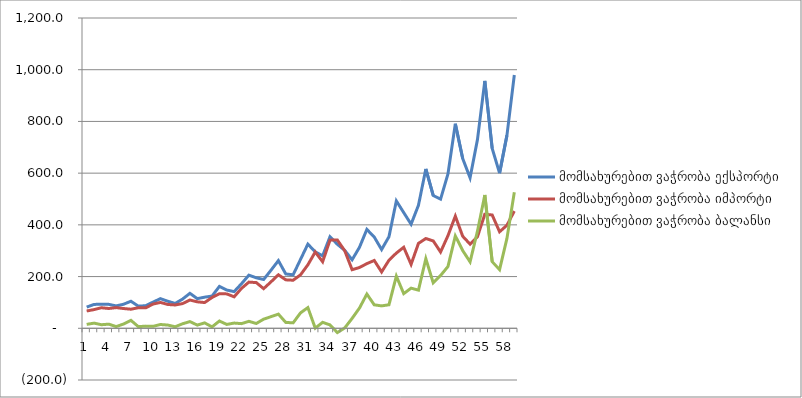
| Category | მომსახურებით ვაჭრობა ექსპორტი  | მომსახურებით ვაჭრობა იმპორტი | მომსახურებით ვაჭრობა ბალანსი |
|---|---|---|---|
| 0 | 81.988 | 66.947 | 15.04 |
| 1 | 92.25 | 72.29 | 19.96 |
| 2 | 93.214 | 79.405 | 13.809 |
| 3 | 92.523 | 76.534 | 15.989 |
| 4 | 86.562 | 80.06 | 6.502 |
| 5 | 92.95 | 76.382 | 16.568 |
| 6 | 104.612 | 73.803 | 30.809 |
| 7 | 85.676 | 79.382 | 6.294 |
| 8 | 87.345 | 78.991 | 8.354 |
| 9 | 101.22 | 93.696 | 7.525 |
| 10 | 114.616 | 99.961 | 14.656 |
| 11 | 104.598 | 92.133 | 12.465 |
| 12 | 96.102 | 90.163 | 5.939 |
| 13 | 112.856 | 95.466 | 17.39 |
| 14 | 135.186 | 109.319 | 25.867 |
| 15 | 114.699 | 102.348 | 12.351 |
| 16 | 120.398 | 99.522 | 20.876 |
| 17 | 124.571 | 119.128 | 5.443 |
| 18 | 161.882 | 133.812 | 28.07 |
| 19 | 147.911 | 132.982 | 14.929 |
| 20 | 141.812 | 121.639 | 20.172 |
| 21 | 172.457 | 154.479 | 17.977 |
| 22 | 205.507 | 178.573 | 26.934 |
| 23 | 195.268 | 176.761 | 18.507 |
| 24 | 188.633 | 153.281 | 35.352 |
| 25 | 224.576 | 179.624 | 44.951 |
| 26 | 261.754 | 206.958 | 54.796 |
| 27 | 210.124 | 187.399 | 22.725 |
| 28 | 206.876 | 185.862 | 21.014 |
| 29 | 266.162 | 206.602 | 59.56 |
| 30 | 325.432 | 245.425 | 80.007 |
| 31 | 295.639 | 295.031 | 0.608 |
| 32 | 280.197 | 257.248 | 22.949 |
| 33 | 354.066 | 340.846 | 13.22 |
| 34 | 324.889 | 341.447 | -16.558 |
| 35 | 301.302 | 299.882 | 1.419 |
| 36 | 264.904 | 226.562 | 38.342 |
| 37 | 313.311 | 235.037 | 78.274 |
| 38 | 382.383 | 249.991 | 132.392 |
| 39 | 353.01 | 262.293 | 90.717 |
| 40 | 304.484 | 217.879 | 86.605 |
| 41 | 354.264 | 263.233 | 91.031 |
| 42 | 492.6 | 290.889 | 201.711 |
| 43 | 447.424 | 313.317 | 134.107 |
| 44 | 402.434 | 247.232 | 155.202 |
| 45 | 475.907 | 328.431 | 147.475 |
| 46 | 616.171 | 347.095 | 269.076 |
| 47 | 513.646 | 337.934 | 175.712 |
| 48 | 499.262 | 295.085 | 204.176 |
| 49 | 596.895 | 358.072 | 238.823 |
| 50 | 791.094 | 433.797 | 357.297 |
| 51 | 656.412 | 355.855 | 300.557 |
| 52 | 582.177 | 325.311 | 256.866 |
| 53 | 729.497 | 354.02 | 375.476 |
| 54 | 956.513 | 441.031 | 515.482 |
| 55 | 695.846 | 438.199 | 257.647 |
| 56 | 600.058 | 373.271 | 226.788 |
| 57 | 746.021 | 398.426 | 347.594 |
| 58 | 979.705 | 453.243 | 526.462 |